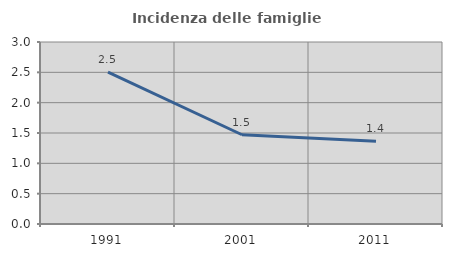
| Category | Incidenza delle famiglie numerose |
|---|---|
| 1991.0 | 2.502 |
| 2001.0 | 1.471 |
| 2011.0 | 1.365 |